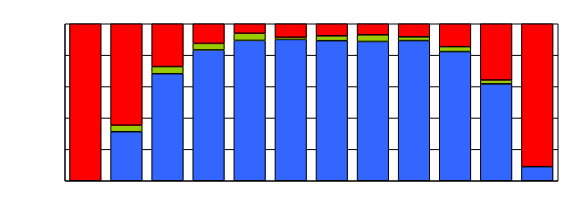
| Category | Series 0 | Series 1 | Series 2 |
|---|---|---|---|
| 0 | 0 | 0 | 138 |
| 1 | 15 | 2 | 31 |
| 2 | 30 | 2 | 12 |
| 3 | 40 | 2 | 6 |
| 4 | 59 | 3 | 4 |
| 5 | 63 | 1 | 6 |
| 6 | 58 | 2 | 5 |
| 7 | 63 | 3 | 5 |
| 8 | 75 | 2 | 7 |
| 9 | 79 | 3 | 14 |
| 10 | 50 | 2 | 29 |
| 11 | 21 | 0 | 213 |